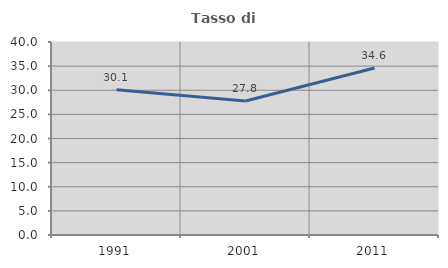
| Category | Tasso di occupazione   |
|---|---|
| 1991.0 | 30.128 |
| 2001.0 | 27.761 |
| 2011.0 | 34.604 |